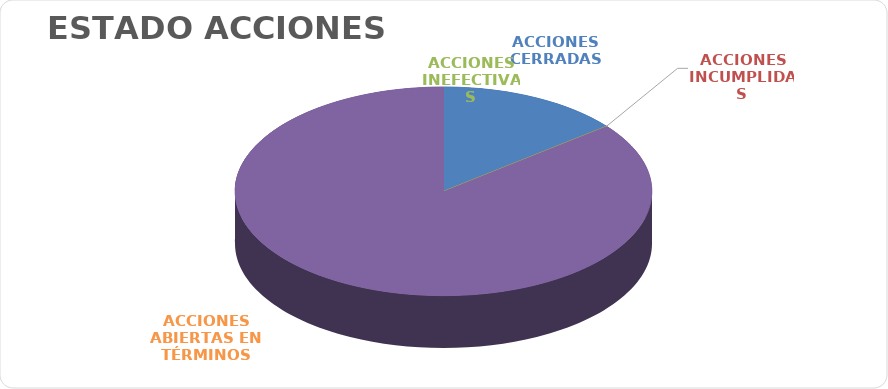
| Category | Series 0 |
|---|---|
| ACCIONES CERRADAS | 22 |
| ACCIONES INCUMPLIDAS | 0 |
| ACCIONES INEFECTIVAS | 0 |
| ACCIONES ABIERTAS EN TÉRMINOS | 132 |